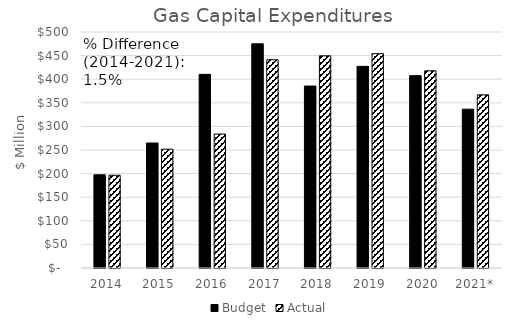
| Category | Budget | Actual |
|---|---|---|
| 2014 | 197.522 | 196.442 |
| 2015 | 264.847 | 251.777 |
| 2016 | 410.321 | 283.777 |
| 2017 | 474.899 | 441.189 |
| 2018 | 385.533 | 449.533 |
| 2019 | 427.186 | 454.029 |
| 2020 | 407.517 | 417.796 |
| 2021* | 336.522 | 366.822 |